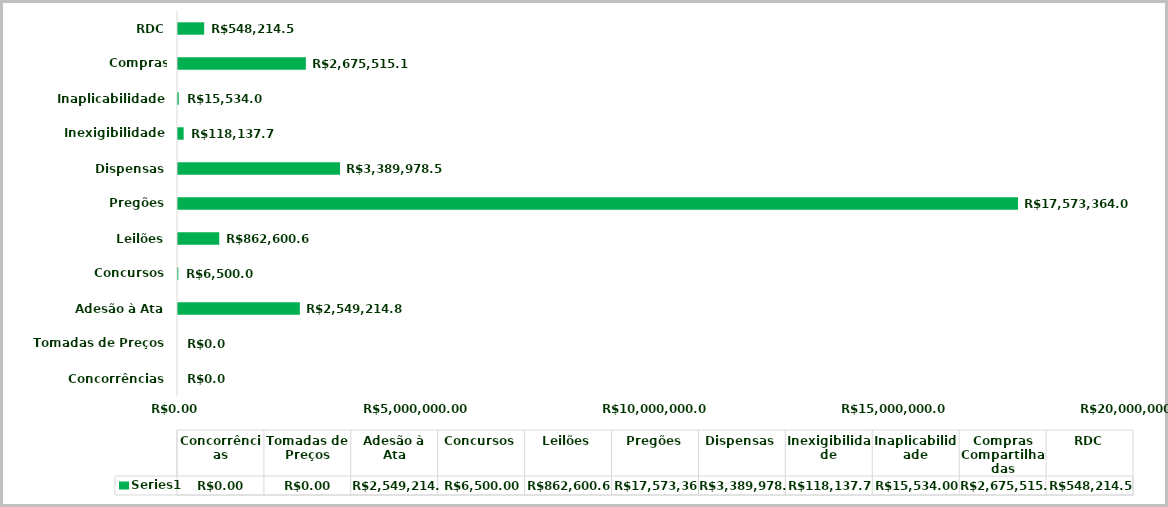
| Category | Series 0 |
|---|---|
| Concorrências | 0 |
| Tomadas de Preços | 0 |
| Adesão à Ata | 2549214.82 |
| Concursos | 6500 |
| Leilões | 862600.64 |
| Pregões | 17573364.06 |
| Dispensas | 3389978.51 |
| Inexigibilidade | 118137.7 |
| Inaplicabilidade | 15534 |
| Compras Compartilhadas | 2675515.19 |
| RDC | 548214.56 |